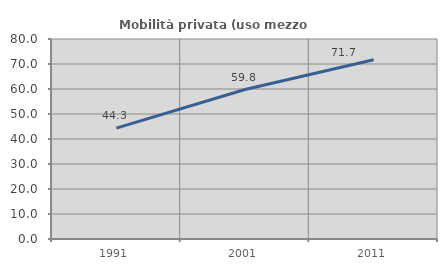
| Category | Mobilità privata (uso mezzo privato) |
|---|---|
| 1991.0 | 44.344 |
| 2001.0 | 59.785 |
| 2011.0 | 71.674 |